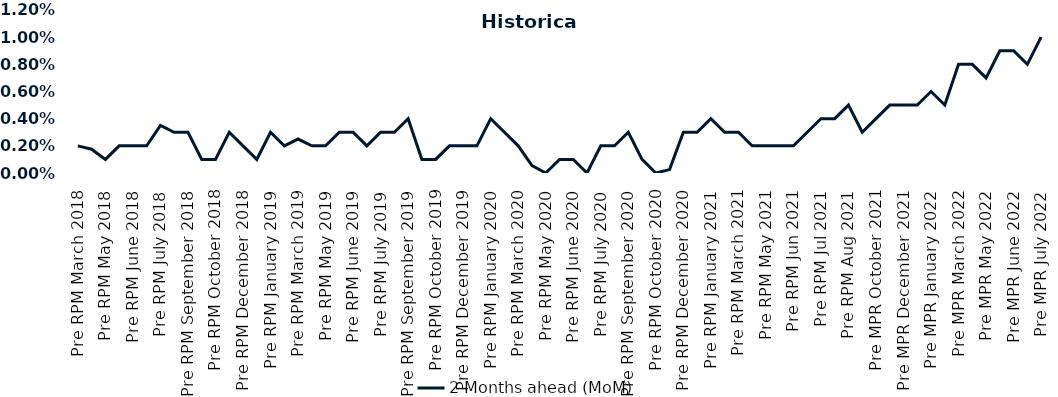
| Category | 2 Months ahead (MoM) |
|---|---|
| Pre RPM March 2018 | 0.002 |
| Post RPM March 2018 | 0.002 |
| Pre RPM May 2018 | 0.001 |
| Post RPM May 2018 | 0.002 |
| Pre RPM June 2018 | 0.002 |
| Post RPM June 2018 | 0.002 |
| Pre RPM July 2018 | 0.004 |
| Post RPM July 2018 | 0.003 |
| Pre RPM September 2018 | 0.003 |
| Post RPM September 2018 | 0.001 |
| Pre RPM October 2018 | 0.001 |
| Post RPM October 2018 | 0.003 |
| Pre RPM December 2018 | 0.002 |
| Post RPM December 2018 | 0.001 |
| Pre RPM January 2019 | 0.003 |
| Post RPM January 2019 | 0.002 |
| Pre RPM March 2019 | 0.002 |
| Post RPM March 2019 | 0.002 |
| Pre RPM May 2019 | 0.002 |
| Post RPM May 2019 | 0.003 |
| Pre RPM June 2019 | 0.003 |
| Post RPM June 2019 | 0.002 |
| Pre RPM July 2019 | 0.003 |
| Post RPM July 2019 | 0.003 |
| Pre RPM September 2019 | 0.004 |
| Post RPM September 2019 | 0.001 |
| Pre RPM October 2019 | 0.001 |
| Post RPM October 2019 | 0.002 |
| Pre RPM December 2019 | 0.002 |
| Post RPM December 2019 | 0.002 |
| Pre RPM January 2020 | 0.004 |
| Post RPM January 2020 | 0.003 |
| Pre RPM March 2020 | 0.002 |
| Post RPM March 2020 | 0.001 |
| Pre RPM May 2020 | 0 |
| Post RPM May 2020 | 0.001 |
| Pre RPM June 2020 | 0.001 |
| Post RPM June 2020 | 0 |
| Pre RPM July 2020 | 0.002 |
| Post RPM July 2020 | 0.002 |
| Pre RPM September 2020 | 0.003 |
| Post RPM September 2020 | 0.001 |
| Pre RPM October 2020 | 0 |
| Post RPM October 2020 | 0 |
| Pre RPM December 2020 | 0.003 |
|  Post RPM December 2020 | 0.003 |
| Pre RPM January 2021 | 0.004 |
| Post RPM January 2021 | 0.003 |
|  Pre RPM March 2021 | 0.003 |
|  Post RPM March 2021 | 0.002 |
|  Pre RPM May 2021 | 0.002 |
|  Post RPM May 2021 | 0.002 |
|  Pre RPM Jun 2021 | 0.002 |
|   Post RPM Jun 2021 | 0.003 |
| Pre RPM Jul 2021 | 0.004 |
|  Post RPM Jul 2021 | 0.004 |
| Pre RPM Aug 2021 | 0.005 |
|  Post RPM Aug 2021 | 0.003 |
| Pre MPR October 2021 | 0.004 |
| Post MPR October 2021 | 0.005 |
| Pre MPR December 2021 | 0.005 |
| Post MPR December 2021 | 0.005 |
| Pre MPR January 2022 | 0.006 |
| Post MPR January 2022 | 0.005 |
| Pre MPR March 2022 | 0.008 |
| Post MPR March 2022 | 0.008 |
| Pre MPR May 2022 | 0.007 |
| Post MPR May 2022 | 0.009 |
| Pre MPR June 2022 | 0.009 |
| Post MPR June 2022 | 0.008 |
| Pre MPR July 2022 | 0.01 |